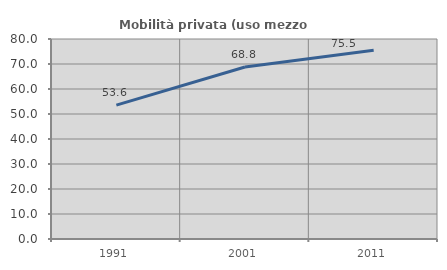
| Category | Mobilità privata (uso mezzo privato) |
|---|---|
| 1991.0 | 53.566 |
| 2001.0 | 68.8 |
| 2011.0 | 75.527 |